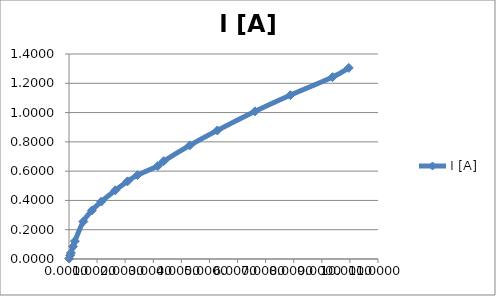
| Category | I [A] |
|---|---|
| 0.0048 | 0.003 |
| 0.043 | 0.026 |
| 0.068 | 0.042 |
| 0.143 | 0.085 |
| 0.209 | 0.122 |
| 0.509 | 0.256 |
| 0.811 | 0.331 |
| 1.15 | 0.392 |
| 1.65 | 0.469 |
| 2.08 | 0.53 |
| 2.44 | 0.573 |
| 3.16 | 0.635 |
| 3.37 | 0.668 |
| 4.3 | 0.776 |
| 5.28 | 0.878 |
| 6.62 | 1.008 |
| 7.88 | 1.119 |
| 9.38 | 1.242 |
| 9.96 | 1.305 |